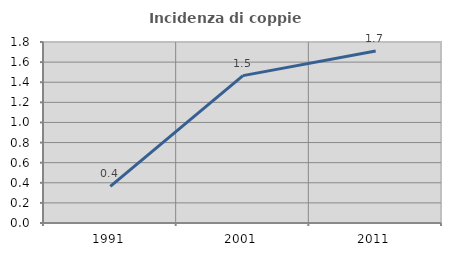
| Category | Incidenza di coppie miste |
|---|---|
| 1991.0 | 0.364 |
| 2001.0 | 1.466 |
| 2011.0 | 1.711 |